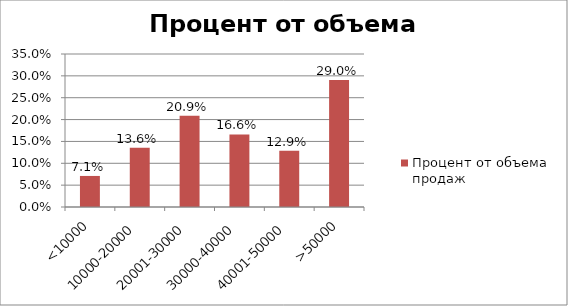
| Category | Процент от объема продаж |
|---|---|
| <10000 | 0.071 |
| 10000-20000 | 0.136 |
| 20001-30000 | 0.209 |
| 30000-40000 | 0.166 |
| 40001-50000 | 0.129 |
| >50000 | 0.29 |